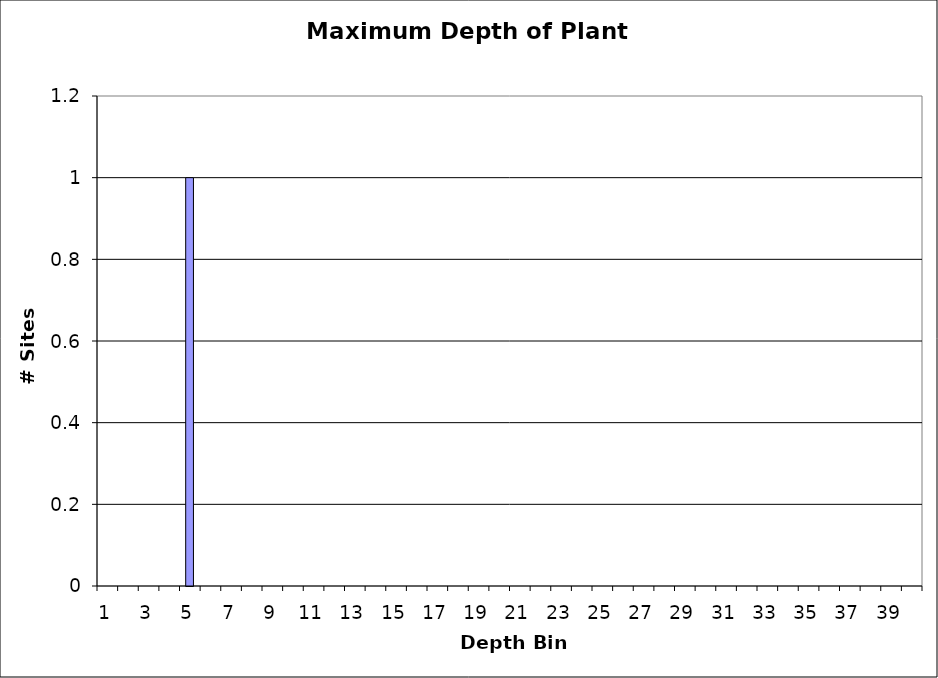
| Category | Series 0 |
|---|---|
| 1.0 | 0 |
| 2.0 | 0 |
| 3.0 | 0 |
| 4.0 | 0 |
| 5.0 | 1 |
| 6.0 | 0 |
| 7.0 | 0 |
| 8.0 | 0 |
| 9.0 | 0 |
| 10.0 | 0 |
| 11.0 | 0 |
| 12.0 | 0 |
| 13.0 | 0 |
| 14.0 | 0 |
| 15.0 | 0 |
| 16.0 | 0 |
| 17.0 | 0 |
| 18.0 | 0 |
| 19.0 | 0 |
| 20.0 | 0 |
| 21.0 | 0 |
| 22.0 | 0 |
| 23.0 | 0 |
| 24.0 | 0 |
| 25.0 | 0 |
| 26.0 | 0 |
| 27.0 | 0 |
| 28.0 | 0 |
| 29.0 | 0 |
| 30.0 | 0 |
| 31.0 | 0 |
| 32.0 | 0 |
| 33.0 | 0 |
| 34.0 | 0 |
| 35.0 | 0 |
| 36.0 | 0 |
| 37.0 | 0 |
| 38.0 | 0 |
| 39.0 | 0 |
| 40.0 | 0 |